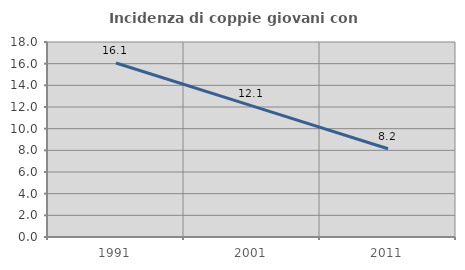
| Category | Incidenza di coppie giovani con figli |
|---|---|
| 1991.0 | 16.058 |
| 2001.0 | 12.103 |
| 2011.0 | 8.15 |